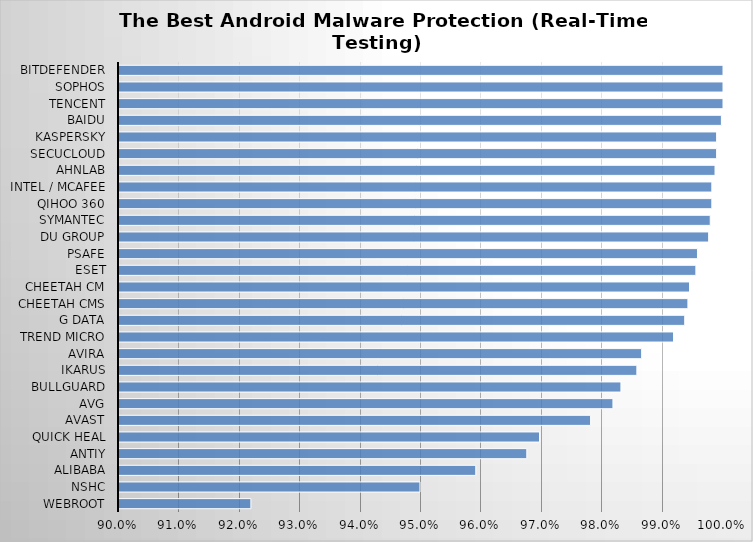
| Category | Series 0 |
|---|---|
| Webroot | 0.922 |
| NSHC | 0.95 |
| Alibaba | 0.959 |
| Antiy | 0.968 |
| Quick Heal | 0.97 |
| Avast | 0.978 |
| AVG | 0.982 |
| BullGuard | 0.983 |
| Ikarus | 0.986 |
| Avira | 0.987 |
| Trend Micro | 0.992 |
| G Data | 0.994 |
| Cheetah CMS | 0.994 |
| Cheetah CM | 0.994 |
| ESET | 0.996 |
| PSafe | 0.996 |
| DU Group | 0.998 |
| Symantec | 0.998 |
| Qihoo 360 | 0.998 |
| Intel / McAfee | 0.998 |
| AhnLab | 0.999 |
| Secucloud | 0.999 |
| Kaspersky | 0.999 |
| Baidu | 1 |
| Tencent | 1 |
| Sophos | 1 |
| Bitdefender | 1 |